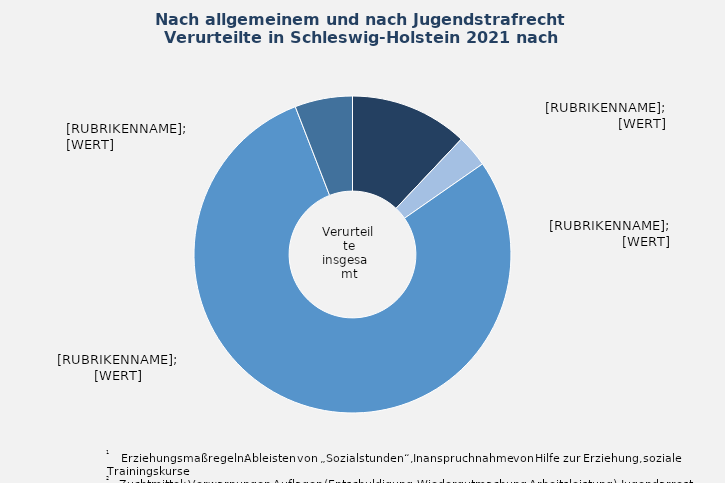
| Category | in Prozent |
|---|---|
| Freiheits- /Jugendstrafe mit Strafaussetzung zur Bewährung | 12.034 |
| Freiheits- /Jugendstrafe ohne Strafaussetzung zur Bewährung | 3.283 |
| Geldstrafe | 78.805 |
| Erziehungsmaßregeln¹, Zuchtmittel² | 5.878 |